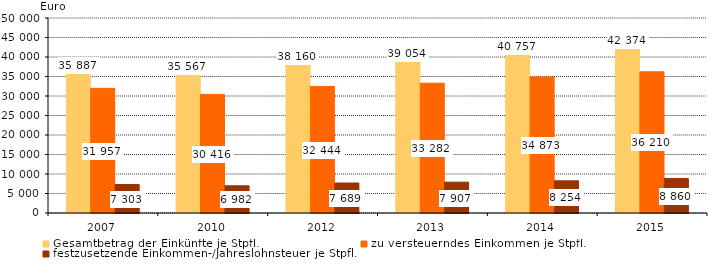
| Category | Gesamtbetrag der Einkünfte je Stpfl. | zu versteuerndes Einkommen je Stpfl. | festzusetzende Einkommen-/Jahreslohnsteuer je Stpfl. |
|---|---|---|---|
| 2007.0 | 35887 | 31957 | 7303 |
| 2010.0 | 35567 | 30416 | 6982 |
| 2012.0 | 38160 | 32444 | 7689 |
| 2013.0 | 39054 | 33282 | 7907 |
| 2014.0 | 40757 | 34873 | 8254 |
| 2015.0 | 42374 | 36210 | 8860 |